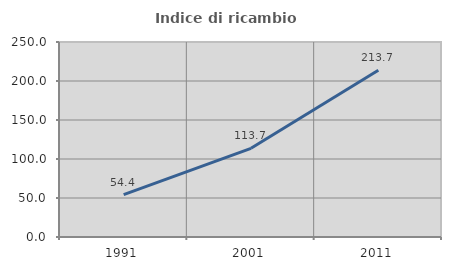
| Category | Indice di ricambio occupazionale  |
|---|---|
| 1991.0 | 54.412 |
| 2001.0 | 113.69 |
| 2011.0 | 213.669 |